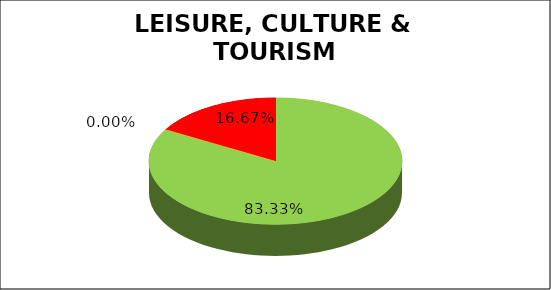
| Category | Q3 |
|---|---|
| Green | 0.833 |
| Amber | 0 |
| Red | 0.167 |